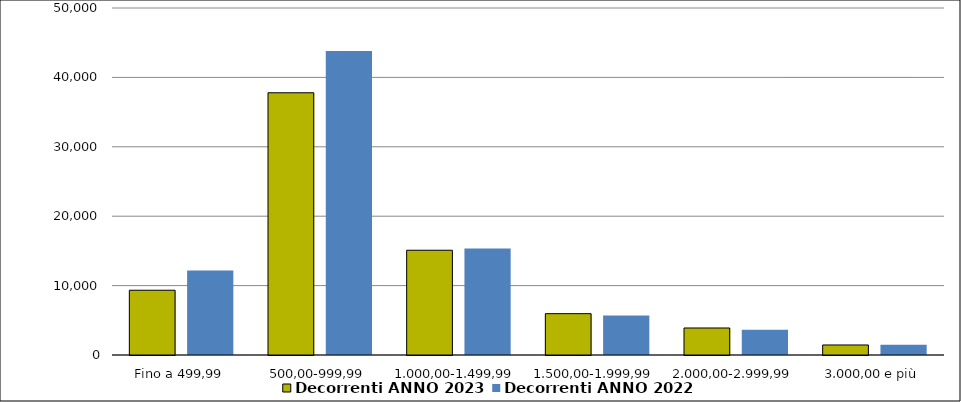
| Category | Decorrenti ANNO 2023 | Decorrenti ANNO 2022 |
|---|---|---|
|  Fino a 499,99  | 9330 | 12162 |
|  500,00-999,99  | 37787 | 43820 |
|  1.000,00-1.499,99  | 15095 | 15330 |
|  1.500,00-1.999,99  | 5956 | 5691 |
|  2.000,00-2.999,99  | 3891 | 3656 |
|  3.000,00 e più  | 1444 | 1481 |